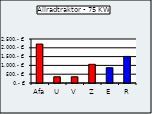
| Category | Allradtraktor - 75 KW |
|---|---|
| Afa | 2213.125 |
| U | 354.1 |
| V | 354.1 |
| Z | 1062.3 |
| E | 869.04 |
| R | 1508.466 |